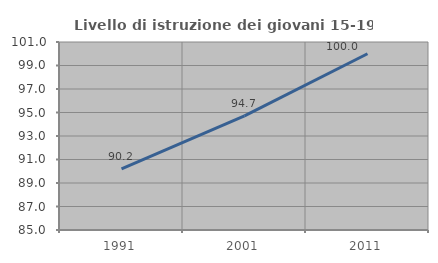
| Category | Livello di istruzione dei giovani 15-19 anni |
|---|---|
| 1991.0 | 90.208 |
| 2001.0 | 94.712 |
| 2011.0 | 100 |